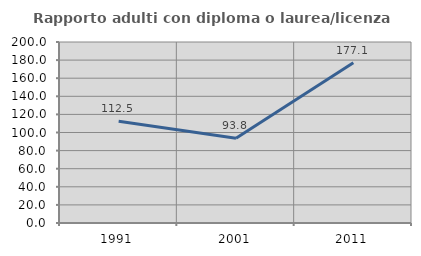
| Category | Rapporto adulti con diploma o laurea/licenza media  |
|---|---|
| 1991.0 | 112.5 |
| 2001.0 | 93.75 |
| 2011.0 | 177.143 |